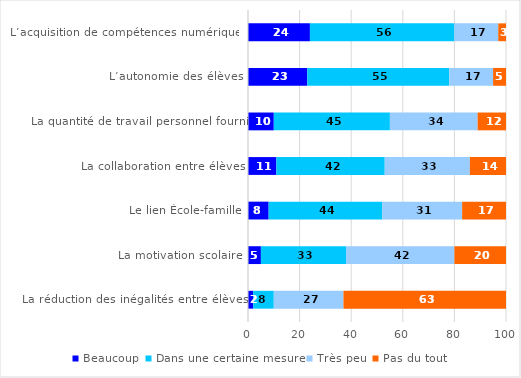
| Category | Beaucoup | Dans une certaine mesure | Très peu | Pas du tout |
|---|---|---|---|---|
| L’acquisition de compétences numériques | 24 | 56 | 17 | 3 |
| L’autonomie des élèves | 23 | 55 | 17 | 5 |
| La quantité de travail personnel fourni | 10 | 45 | 34 | 12 |
| La collaboration entre élèves | 11 | 42 | 33 | 14 |
| Le lien École-famille | 8 | 44 | 31 | 17 |
| La motivation scolaire | 5 | 33 | 42 | 20 |
| La réduction des inégalités entre élèves | 2 | 8 | 27 | 63 |